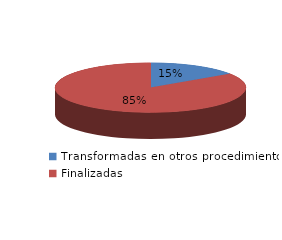
| Category | Series 0 |
|---|---|
| Transformadas en otros procedimientos | 13049 |
| Finalizadas | 71341 |